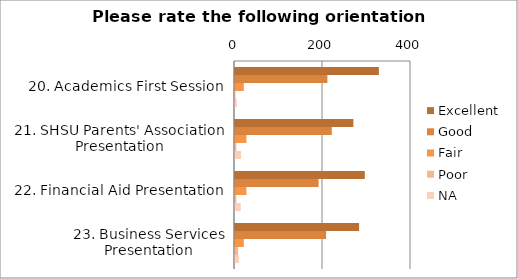
| Category | Excellent | Good | Fair | Poor | NA |
|---|---|---|---|---|---|
| 20. Academics First Session | 327 | 210 | 20 | 1 | 4 |
| 21. SHSU Parents' Association Presentation | 269 | 220 | 26 | 3 | 14 |
| 22. Financial Aid Presentation | 295 | 190 | 26 | 3 | 13 |
| 23. Business Services Presentation | 282 | 207 | 20 | 7 | 9 |